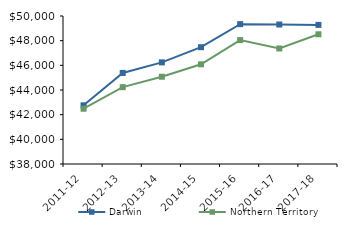
| Category | Darwin | Northern Territory |
|---|---|---|
| 2011-12 | 42757.66 | 42481 |
| 2012-13 | 45382.84 | 44232.02 |
| 2013-14 | 46241 | 45075.51 |
| 2014-15 | 47470.9 | 46083.65 |
| 2015-16 | 49339 | 48046.27 |
| 2016-17 | 49309.4 | 47367.05 |
| 2017-18 | 49280.23 | 48519 |